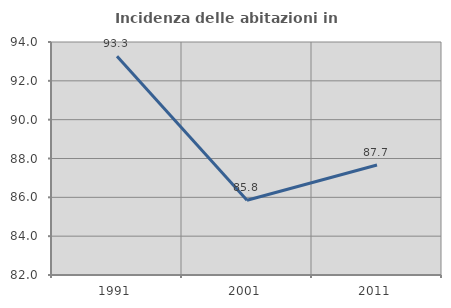
| Category | Incidenza delle abitazioni in proprietà  |
|---|---|
| 1991.0 | 93.269 |
| 2001.0 | 85.846 |
| 2011.0 | 87.667 |